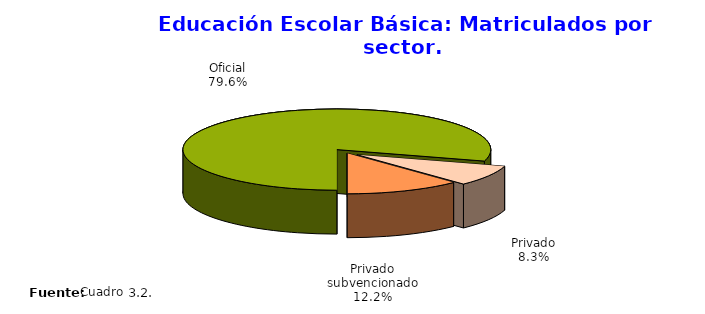
| Category | Series 0 |
|---|---|
| Oficial | 812235 |
| Privado | 84533 |
| Privado subvencionado | 124063 |